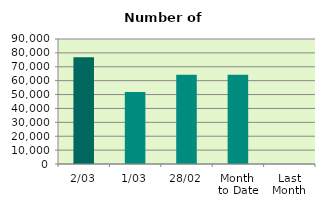
| Category | Series 0 |
|---|---|
| 2/03 | 76780 |
| 1/03 | 51778 |
| 28/02 | 64222 |
| Month 
to Date | 64279 |
| Last
Month | 0 |